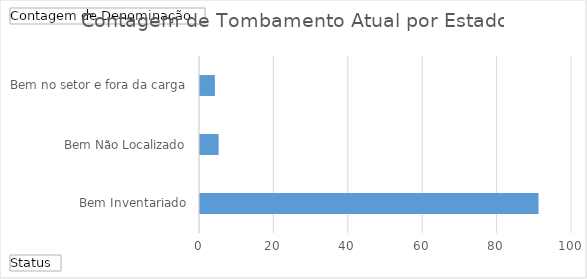
| Category | Total |
|---|---|
| Bem Inventariado | 91 |
| Bem Não Localizado | 5 |
| Bem no setor e fora da carga | 4 |